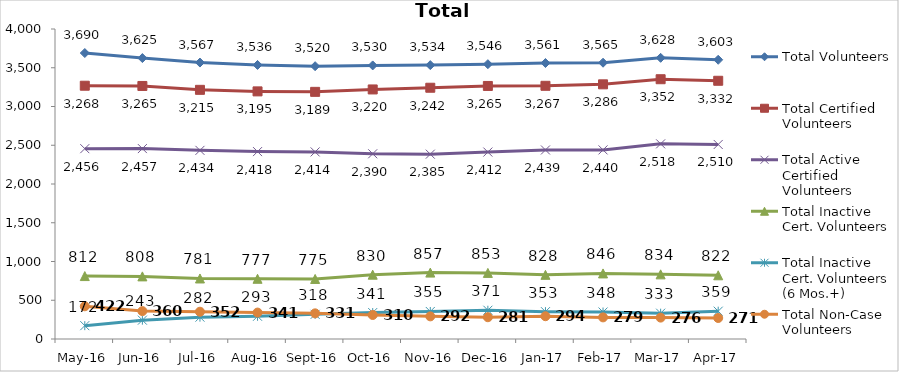
| Category | Total Volunteers | Total Certified Volunteers | Total Active Certified Volunteers | Total Inactive Cert. Volunteers | Total Inactive Cert. Volunteers (6 Mos.+) | Total Non-Case Volunteers |
|---|---|---|---|---|---|---|
| May-16 | 3690 | 3268 | 2456 | 812 | 172 | 422 |
| Jun-16 | 3625 | 3265 | 2457 | 808 | 243 | 360 |
| Jul-16 | 3567 | 3215 | 2434 | 781 | 282 | 352 |
| Aug-16 | 3536 | 3195 | 2418 | 777 | 293 | 341 |
| Sep-16 | 3520 | 3189 | 2414 | 775 | 318 | 331 |
| Oct-16 | 3530 | 3220 | 2390 | 830 | 341 | 310 |
| Nov-16 | 3534 | 3242 | 2385 | 857 | 355 | 292 |
| Dec-16 | 3546 | 3265 | 2412 | 853 | 371 | 281 |
| Jan-17 | 3561 | 3267 | 2439 | 828 | 353 | 294 |
| Feb-17 | 3565 | 3286 | 2440 | 846 | 348 | 279 |
| Mar-17 | 3628 | 3352 | 2518 | 834 | 333 | 276 |
| Apr-17 | 3603 | 3332 | 2510 | 822 | 359 | 271 |